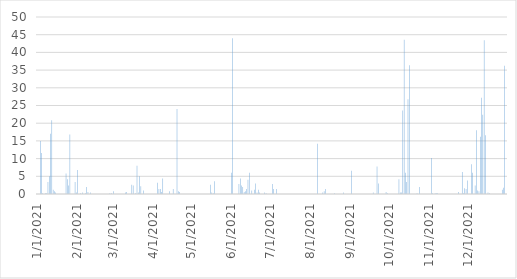
| Category | Series 0 |
|---|---|
| 1/1/21 | 0 |
| 1/2/21 | 0 |
| 1/3/21 | 15 |
| 1/4/21 | 11.6 |
| 1/5/21 | 0.2 |
| 1/6/21 | 0 |
| 1/7/21 | 0.2 |
| 1/8/21 | 0.2 |
| 1/9/21 | 3.4 |
| 1/10/21 | 5 |
| 1/11/21 | 17 |
| 1/12/21 | 20.8 |
| 1/13/21 | 1.2 |
| 1/14/21 | 0.8 |
| 1/15/21 | 0.4 |
| 1/16/21 | 0 |
| 1/17/21 | 0 |
| 1/18/21 | 0 |
| 1/19/21 | 0 |
| 1/20/21 | 0 |
| 1/21/21 | 0 |
| 1/22/21 | 0 |
| 1/23/21 | 5.8 |
| 1/24/21 | 4.2 |
| 1/25/21 | 2.4 |
| 1/26/21 | 16.8 |
| 1/27/21 | 0 |
| 1/28/21 | 0 |
| 1/29/21 | 0 |
| 1/30/21 | 3.4 |
| 1/31/21 | 0.4 |
| 2/1/21 | 6.8 |
| 2/2/21 | 0 |
| 2/3/21 | 0.2 |
| 2/4/21 | 0 |
| 2/5/21 | 0.4 |
| 2/6/21 | 0 |
| 2/7/21 | 0.2 |
| 2/8/21 | 2 |
| 2/9/21 | 0.6 |
| 2/10/21 | 0 |
| 2/11/21 | 0.4 |
| 2/12/21 | 0 |
| 2/13/21 | 0 |
| 2/14/21 | 0 |
| 2/15/21 | 0 |
| 2/16/21 | 0 |
| 2/17/21 | 0 |
| 2/18/21 | 0 |
| 2/19/21 | 0 |
| 2/20/21 | 0 |
| 2/21/21 | 0 |
| 2/22/21 | 0 |
| 2/23/21 | 0 |
| 2/24/21 | 0 |
| 2/25/21 | 0 |
| 2/26/21 | 0.2 |
| 2/27/21 | 0.2 |
| 2/28/21 | 0 |
| 3/1/21 | 0.8 |
| 3/2/21 | 0 |
| 3/3/21 | 0 |
| 3/4/21 | 0 |
| 3/5/21 | 0 |
| 3/6/21 | 0 |
| 3/7/21 | 0 |
| 3/8/21 | 0 |
| 3/9/21 | 0 |
| 3/10/21 | 0.4 |
| 3/11/21 | 0.6 |
| 3/12/21 | 0 |
| 3/13/21 | 0 |
| 3/14/21 | 0 |
| 3/15/21 | 2.6 |
| 3/16/21 | 2.4 |
| 3/17/21 | 0 |
| 3/18/21 | 0.2 |
| 3/19/21 | 8 |
| 3/20/21 | 0.4 |
| 3/21/21 | 5 |
| 3/22/21 | 2.2 |
| 3/23/21 | 0 |
| 3/24/21 | 1 |
| 3/25/21 | 0 |
| 3/26/21 | 0 |
| 3/27/21 | 0 |
| 3/28/21 | 0 |
| 3/29/21 | 0 |
| 3/30/21 | 0 |
| 3/31/21 | 0 |
| 4/1/21 | 0 |
| 4/2/21 | 0 |
| 4/3/21 | 0 |
| 4/4/21 | 3.2 |
| 4/5/21 | 1.4 |
| 4/6/21 | 1.4 |
| 4/7/21 | 0.6 |
| 4/8/21 | 4.4 |
| 4/9/21 | 0 |
| 4/10/21 | 0 |
| 4/11/21 | 0 |
| 4/12/21 | 0 |
| 4/13/21 | 0.8 |
| 4/14/21 | 0 |
| 4/15/21 | 0 |
| 4/16/21 | 1.4 |
| 4/17/21 | 0 |
| 4/18/21 | 0 |
| 4/19/21 | 24 |
| 4/20/21 | 0.8 |
| 4/21/21 | 0.6 |
| 4/22/21 | 0 |
| 4/23/21 | 0 |
| 4/24/21 | 0 |
| 4/25/21 | 0 |
| 4/26/21 | 0 |
| 4/27/21 | 0 |
| 4/28/21 | 0 |
| 4/29/21 | 0 |
| 4/30/21 | 0 |
| 5/1/21 | 0 |
| 5/2/21 | 0 |
| 5/3/21 | 0 |
| 5/4/21 | 0 |
| 5/5/21 | 0 |
| 5/6/21 | 0 |
| 5/7/21 | 0 |
| 5/8/21 | 0 |
| 5/9/21 | 0 |
| 5/10/21 | 0 |
| 5/11/21 | 0 |
| 5/12/21 | 0 |
| 5/13/21 | 0 |
| 5/14/21 | 0 |
| 5/15/21 | 2.6 |
| 5/16/21 | 0.4 |
| 5/17/21 | 0.2 |
| 5/18/21 | 3.6 |
| 5/19/21 | 0 |
| 5/20/21 | 0 |
| 5/21/21 | 0 |
| 5/22/21 | 0 |
| 5/23/21 | 0 |
| 5/24/21 | 0 |
| 5/25/21 | 0 |
| 5/26/21 | 0 |
| 5/27/21 | 0 |
| 5/28/21 | 0 |
| 5/29/21 | 0 |
| 5/30/21 | 0 |
| 5/31/21 | 6 |
| 6/1/21 | 44 |
| 6/2/21 | 0 |
| 6/3/21 | 0 |
| 6/4/21 | 0 |
| 6/5/21 | 0 |
| 6/6/21 | 2.8 |
| 6/7/21 | 4.4 |
| 6/8/21 | 2.4 |
| 6/9/21 | 2 |
| 6/10/21 | 0.6 |
| 6/11/21 | 0.8 |
| 6/12/21 | 1.4 |
| 6/13/21 | 4 |
| 6/14/21 | 6 |
| 6/15/21 | 0 |
| 6/16/21 | 1 |
| 6/17/21 | 0 |
| 6/18/21 | 1.2 |
| 6/19/21 | 3 |
| 6/20/21 | 0.4 |
| 6/21/21 | 1.2 |
| 6/22/21 | 0.4 |
| 6/23/21 | 0 |
| 6/24/21 | 0 |
| 6/25/21 | 0 |
| 6/26/21 | 0.4 |
| 6/27/21 | 0.2 |
| 6/28/21 | 0 |
| 6/29/21 | 0 |
| 6/30/21 | 0 |
| 7/1/21 | 0 |
| 7/2/21 | 2.8 |
| 7/3/21 | 1.4 |
| 7/4/21 | 0 |
| 7/5/21 | 1.4 |
| 7/6/21 | 0 |
| 7/7/21 | 0 |
| 7/8/21 | 0 |
| 7/9/21 | 0 |
| 7/10/21 | 0 |
| 7/11/21 | 0 |
| 7/12/21 | 0 |
| 7/13/21 | 0 |
| 7/14/21 | 0 |
| 7/15/21 | 0 |
| 7/16/21 | 0 |
| 7/17/21 | 0 |
| 7/18/21 | 0 |
| 7/19/21 | 0 |
| 7/20/21 | 0 |
| 7/21/21 | 0 |
| 7/22/21 | 0 |
| 7/23/21 | 0 |
| 7/24/21 | 0 |
| 7/25/21 | 0 |
| 7/26/21 | 0 |
| 7/27/21 | 0 |
| 7/28/21 | 0 |
| 7/29/21 | 0 |
| 7/30/21 | 0 |
| 7/31/21 | 0 |
| 8/1/21 | 0 |
| 8/2/21 | 0 |
| 8/3/21 | 0 |
| 8/4/21 | 0 |
| 8/5/21 | 0 |
| 8/6/21 | 14.2 |
| 8/7/21 | 0 |
| 8/8/21 | 0 |
| 8/9/21 | 0 |
| 8/10/21 | 0.4 |
| 8/11/21 | 0.8 |
| 8/12/21 | 1.4 |
| 8/13/21 | 0 |
| 8/14/21 | 0 |
| 8/15/21 | 0 |
| 8/16/21 | 0 |
| 8/17/21 | 0 |
| 8/18/21 | 0 |
| 8/19/21 | 0.2 |
| 8/20/21 | 0 |
| 8/21/21 | 0 |
| 8/22/21 | 0 |
| 8/23/21 | 0 |
| 8/24/21 | 0 |
| 8/25/21 | 0 |
| 8/26/21 | 0.4 |
| 8/27/21 | 0 |
| 8/28/21 | 0 |
| 8/29/21 | 0 |
| 8/30/21 | 0 |
| 8/31/21 | 0 |
| 9/1/21 | 6.6 |
| 9/2/21 | 0 |
| 9/3/21 | 0 |
| 9/4/21 | 0 |
| 9/5/21 | 0 |
| 9/6/21 | 0 |
| 9/7/21 | 0 |
| 9/8/21 | 0 |
| 9/9/21 | 0 |
| 9/10/21 | 0 |
| 9/11/21 | 0 |
| 9/12/21 | 0 |
| 9/13/21 | 0 |
| 9/14/21 | 0 |
| 9/15/21 | 0 |
| 9/16/21 | 0 |
| 9/17/21 | 0 |
| 9/18/21 | 0.4 |
| 9/19/21 | 0 |
| 9/20/21 | 0 |
| 9/21/21 | 7.8 |
| 9/22/21 | 3 |
| 9/23/21 | 0 |
| 9/24/21 | 0 |
| 9/25/21 | 0 |
| 9/26/21 | 0 |
| 9/27/21 | 0 |
| 9/28/21 | 0.6 |
| 9/29/21 | 0.2 |
| 9/30/21 | 0 |
| 10/1/21 | 0 |
| 10/2/21 | 0 |
| 10/3/21 | 0 |
| 10/4/21 | 0 |
| 10/5/21 | 0 |
| 10/6/21 | 0 |
| 10/7/21 | 0 |
| 10/8/21 | 4.2 |
| 10/9/21 | 0.4 |
| 10/10/21 | 0.4 |
| 10/11/21 | 23.6 |
| 10/12/21 | 43.6 |
| 10/13/21 | 6 |
| 10/14/21 | 3.4 |
| 10/15/21 | 26.8 |
| 10/16/21 | 36.4 |
| 10/17/21 | 0 |
| 10/18/21 | 0 |
| 10/19/21 | 0 |
| 10/20/21 | 0 |
| 10/21/21 | 0 |
| 10/22/21 | 0.2 |
| 10/23/21 | 0 |
| 10/24/21 | 2 |
| 10/25/21 | 0 |
| 10/26/21 | 0 |
| 10/27/21 | 0 |
| 10/28/21 | 0 |
| 10/29/21 | 0 |
| 10/30/21 | 0 |
| 10/31/21 | 0 |
| 11/1/21 | 0 |
| 11/2/21 | 10.2 |
| 11/3/21 | 0.2 |
| 11/4/21 | 0 |
| 11/5/21 | 0.2 |
| 11/6/21 | 0.2 |
| 11/7/21 | 0.2 |
| 11/8/21 | 0 |
| 11/9/21 | 0 |
| 11/10/21 | 0 |
| 11/11/21 | 0 |
| 11/12/21 | 0 |
| 11/13/21 | 0 |
| 11/14/21 | 0 |
| 11/15/21 | 0 |
| 11/16/21 | 0 |
| 11/17/21 | 0 |
| 11/18/21 | 0 |
| 11/19/21 | 0 |
| 11/20/21 | 0 |
| 11/21/21 | 0 |
| 11/22/21 | 0 |
| 11/23/21 | 0.6 |
| 11/24/21 | 0 |
| 11/25/21 | 0 |
| 11/26/21 | 6.2 |
| 11/27/21 | 0.2 |
| 11/28/21 | 1.6 |
| 11/29/21 | 1.4 |
| 11/30/21 | 3.8 |
| 12/1/21 | 0 |
| 12/2/21 | 0 |
| 12/3/21 | 8.4 |
| 12/4/21 | 6 |
| 12/5/21 | 0 |
| 12/6/21 | 2.4 |
| 12/7/21 | 18 |
| 12/8/21 | 1 |
| 12/9/21 | 0.8 |
| 12/10/21 | 16.2 |
| 12/11/21 | 27.2 |
| 12/12/21 | 22.4 |
| 12/13/21 | 43.4 |
| 12/14/21 | 16.6 |
| 12/15/21 | 0 |
| 12/16/21 | 0.4 |
| 12/17/21 | 0.2 |
| 12/18/21 | 0 |
| 12/19/21 | 0 |
| 12/20/21 | 0 |
| 12/21/21 | 0 |
| 12/22/21 | 0 |
| 12/23/21 | 0 |
| 12/24/21 | 0 |
| 12/25/21 | 0 |
| 12/26/21 | 0 |
| 12/27/21 | 1.2 |
| 12/28/21 | 1.8 |
| 12/29/21 | 36.2 |
| 12/30/21 | 0 |
| 12/31/21 | 0 |